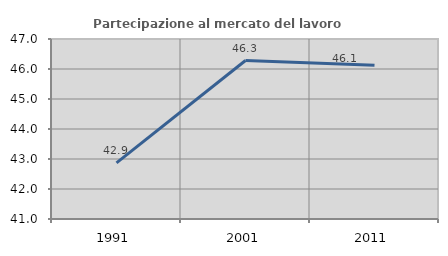
| Category | Partecipazione al mercato del lavoro  femminile |
|---|---|
| 1991.0 | 42.872 |
| 2001.0 | 46.282 |
| 2011.0 | 46.124 |